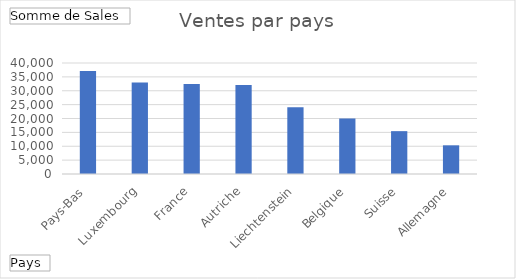
| Category | Total |
|---|---|
| Pays-Bas | 37074.53 |
| Luxembourg | 32931.9 |
| France | 32429.29 |
| Autriche | 32027.82 |
| Liechtenstein | 24044.29 |
| Belgique | 19985.34 |
| Suisse | 15442.82 |
| Allemagne | 10337.1 |